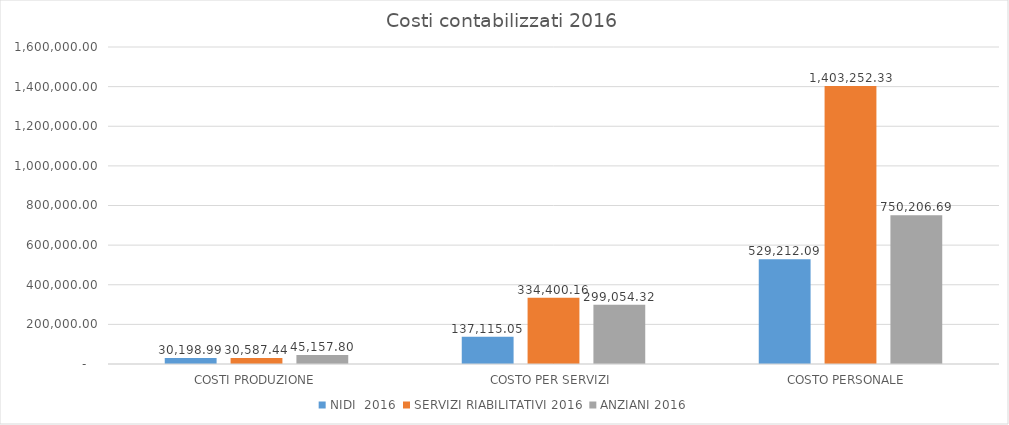
| Category | NIDI  2016 | SERVIZI RIABILITATIVI 2016 | ANZIANI 2016 |
|---|---|---|---|
| COSTI PRODUZIONE | 30198.99 | 30587.44 | 45157.8 |
| COSTO PER SERVIZI  | 137115.05 | 334400.16 | 299054.32 |
| COSTO PERSONALE  | 529212.09 | 1403252.33 | 750206.69 |